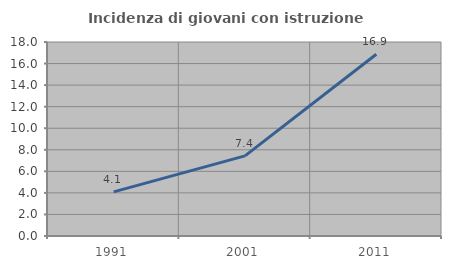
| Category | Incidenza di giovani con istruzione universitaria |
|---|---|
| 1991.0 | 4.098 |
| 2001.0 | 7.431 |
| 2011.0 | 16.859 |